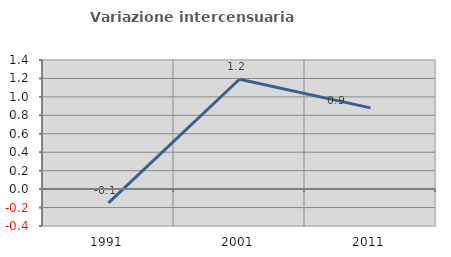
| Category | Variazione intercensuaria annua |
|---|---|
| 1991.0 | -0.149 |
| 2001.0 | 1.191 |
| 2011.0 | 0.881 |